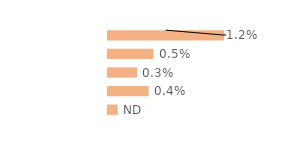
| Category | Series 0 |
|---|---|
| 18-29 ans | 0.012 |
| 30-39 ans | 0.005 |
| 40-49 ans | 0.003 |
| 50-59 ans | 0.004 |
| 60-75 ans | 0.001 |